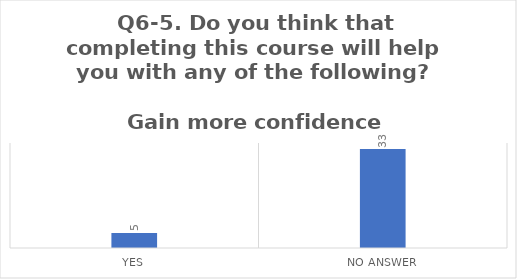
| Category | Q6-5. Do you think that completing this course will help you with any of the following?

Gain more confidence |
|---|---|
| Yes | 5 |
| No Answer | 33 |